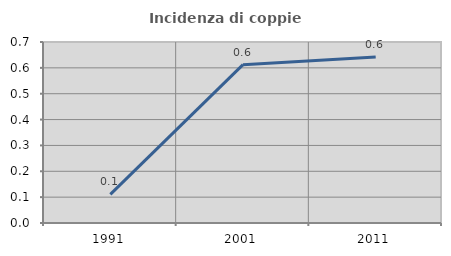
| Category | Incidenza di coppie miste |
|---|---|
| 1991.0 | 0.11 |
| 2001.0 | 0.612 |
| 2011.0 | 0.642 |